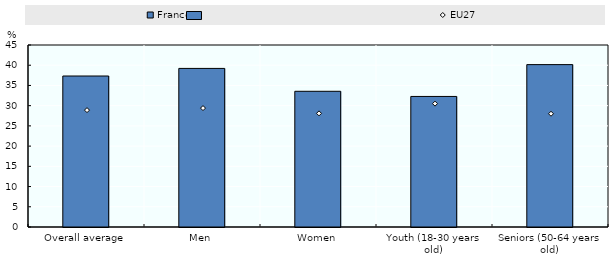
| Category | France |
|---|---|
| Overall average | 37.334 |
| Men | 39.21 |
| Women | 33.555 |
| Youth (18-30 years old) | 32.281 |
| Seniors (50-64 years old) | 40.151 |